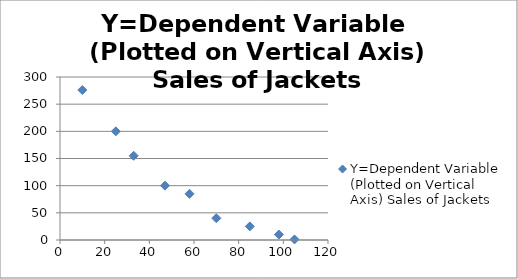
| Category | Y=Dependent Variable  (Plotted on Vertical Axis) Sales of Jackets |
|---|---|
| 10.0 | 276 |
| 25.0 | 200 |
| 33.0 | 155 |
| 47.0 | 100 |
| 58.0 | 85 |
| 70.0 | 40 |
| 85.0 | 25 |
| 98.0 | 10 |
| 105.0 | 1 |